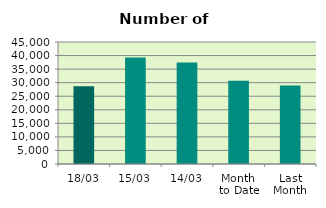
| Category | Series 0 |
|---|---|
| 18/03 | 28680 |
| 15/03 | 39246 |
| 14/03 | 37450 |
| Month 
to Date | 30751.667 |
| Last
Month | 28915.6 |